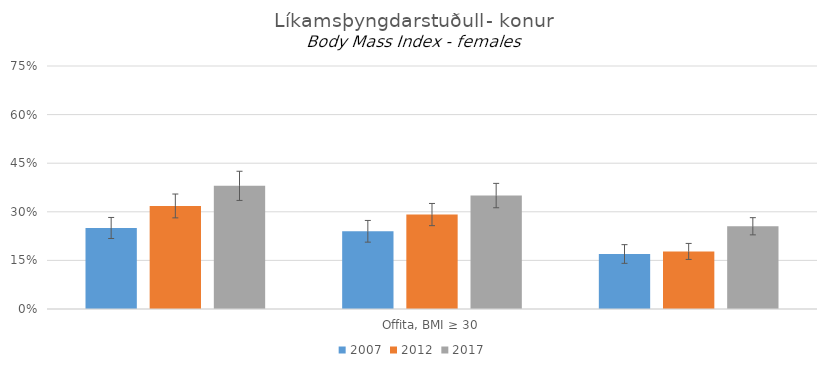
| Category | 2007 | 2012 | 2017 |
|---|---|---|---|
| 0 | 0.25 | 0.318 | 0.38 |
| 1 | 0.24 | 0.291 | 0.35 |
| 2 | 0.17 | 0.178 | 0.255 |